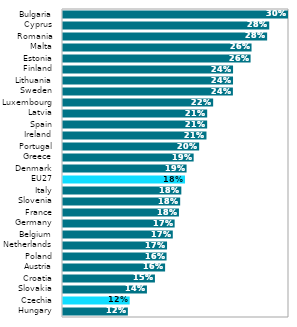
| Category | Series 0 |
|---|---|
| Hungary | 0.122 |
| Czechia | 0.124 |
| Slovakia | 0.143 |
| Croatia | 0.152 |
| Austria | 0.163 |
| Poland | 0.165 |
| Netherlands | 0.165 |
| Belgium | 0.171 |
| Germany | 0.173 |
| France | 0.178 |
| Slovenia | 0.18 |
| Italy | 0.181 |
| EU27 | 0.185 |
| Denmark | 0.187 |
| Greece | 0.195 |
| Portugal | 0.201 |
| Ireland | 0.209 |
| Spain | 0.209 |
| Latvia | 0.209 |
| Luxembourg | 0.216 |
| Sweden | 0.238 |
| Lithuania | 0.238 |
| Finland | 0.238 |
| Estonia | 0.257 |
| Malta | 0.259 |
| Romania | 0.276 |
| Cyprus | 0.278 |
| Bulgaria | 0.304 |